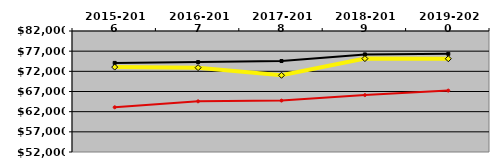
| Category | NATIONAL MEDIAN | WEST MEDIAN | TEXAS LUTHERAN |
|---|---|---|---|
| 2015-2016 | 74088 | 63090 | 73053 |
| 2016-2017 | 74288 | 64561 | 72909 |
| 2017-2018 | 74555 | 64745 | 71021 |
| 2018-2019 | 76199 | 66107 | 75154 |
| 2019-2020 | 76337 | 67222 | 75120 |